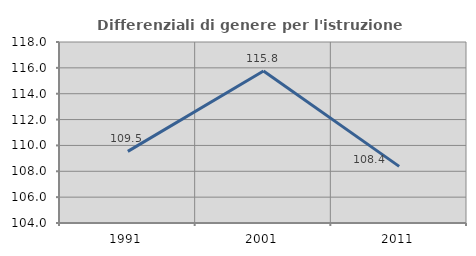
| Category | Differenziali di genere per l'istruzione superiore |
|---|---|
| 1991.0 | 109.54 |
| 2001.0 | 115.76 |
| 2011.0 | 108.381 |